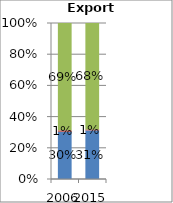
| Category | Agriculture | Fuels and mining | Manufacturing |
|---|---|---|---|
| 2006.0 | 0.303 | 0.009 | 0.688 |
| 2015.0 | 0.311 | 0.007 | 0.682 |